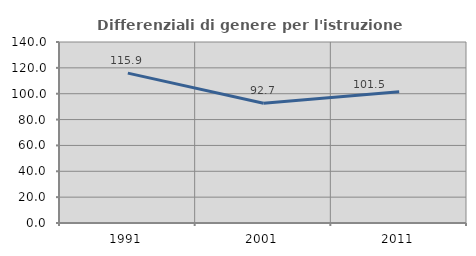
| Category | Differenziali di genere per l'istruzione superiore |
|---|---|
| 1991.0 | 115.905 |
| 2001.0 | 92.672 |
| 2011.0 | 101.452 |